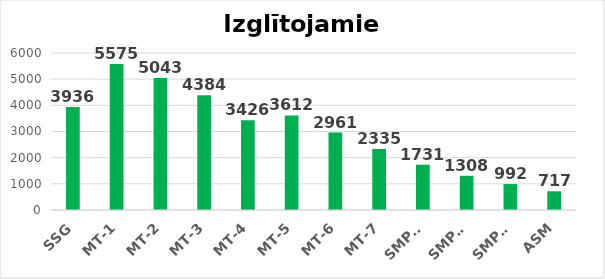
| Category | Izglītojamie |
|---|---|
| SSG | 3936 |
| MT-1 | 5575 |
| MT-2 | 5043 |
| MT-3 | 4384 |
| MT-4 | 3426 |
| MT-5 | 3612 |
| MT-6 | 2961 |
| MT-7 | 2335 |
| SMP-1 | 1731 |
| SMP-2 | 1308 |
| SMP-3 | 992 |
| ASM | 717 |